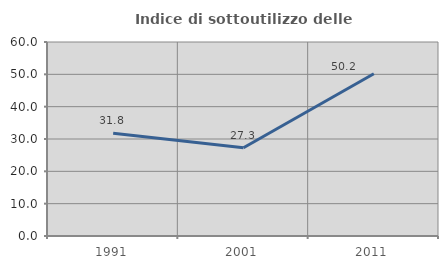
| Category | Indice di sottoutilizzo delle abitazioni  |
|---|---|
| 1991.0 | 31.765 |
| 2001.0 | 27.273 |
| 2011.0 | 50.202 |